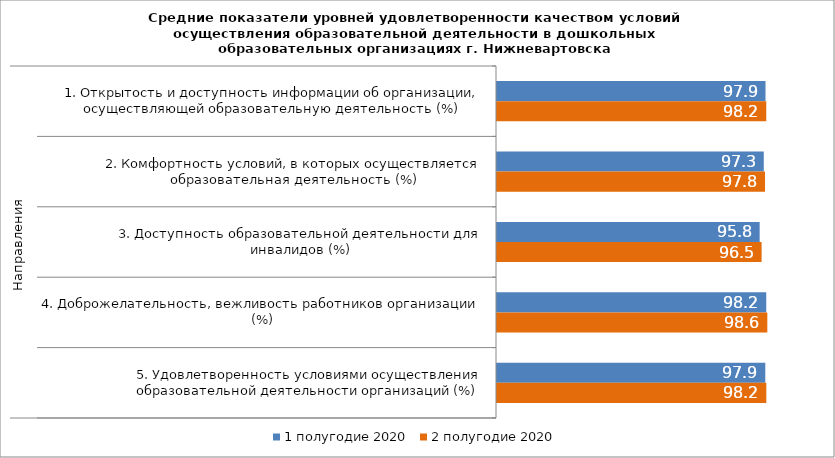
| Category | 1 полугодие 2020 | 2 полугодие 2020 |
|---|---|---|
| 0 | 97.937 | 98.208 |
| 1 | 97.306 | 97.758 |
| 2 | 95.806 | 96.517 |
| 3 | 98.201 | 98.596 |
| 4 | 97.86 | 98.226 |